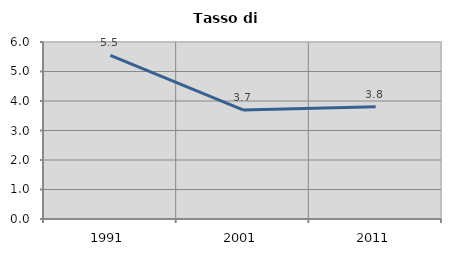
| Category | Tasso di disoccupazione   |
|---|---|
| 1991.0 | 5.546 |
| 2001.0 | 3.698 |
| 2011.0 | 3.805 |